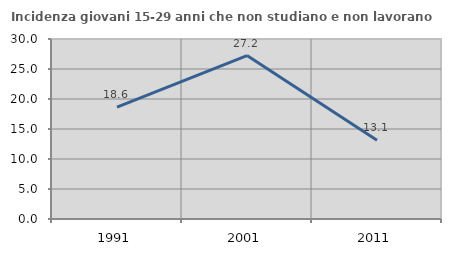
| Category | Incidenza giovani 15-29 anni che non studiano e non lavorano  |
|---|---|
| 1991.0 | 18.642 |
| 2001.0 | 27.243 |
| 2011.0 | 13.139 |